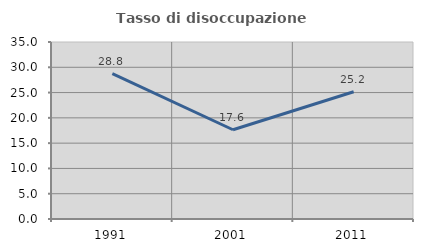
| Category | Tasso di disoccupazione giovanile  |
|---|---|
| 1991.0 | 28.75 |
| 2001.0 | 17.647 |
| 2011.0 | 25.17 |